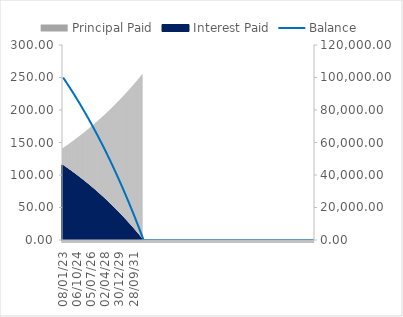
| Category | Principal Paid | Interest Paid |
|---|---|---|
| 08/01/23 | 140.547 | 115.163 |
| 15/01/23 | 140.708 | 115.002 |
| 22/01/23 | 140.87 | 114.839 |
| 29/01/23 | 141.033 | 114.677 |
| 05/02/23 | 141.195 | 114.515 |
| 12/02/23 | 141.358 | 114.352 |
| 19/02/23 | 141.52 | 114.189 |
| 26/02/23 | 141.683 | 114.026 |
| 05/03/23 | 141.847 | 113.863 |
| 12/03/23 | 142.01 | 113.7 |
| 19/03/23 | 142.174 | 113.536 |
| 26/03/23 | 142.337 | 113.373 |
| 02/04/23 | 142.501 | 113.209 |
| 09/04/23 | 142.665 | 113.045 |
| 16/04/23 | 142.83 | 112.88 |
| 23/04/23 | 142.994 | 112.716 |
| 30/04/23 | 143.159 | 112.551 |
| 07/05/23 | 143.324 | 112.386 |
| 14/05/23 | 143.489 | 112.221 |
| 21/05/23 | 143.654 | 112.056 |
| 28/05/23 | 143.819 | 111.891 |
| 04/06/23 | 143.985 | 111.725 |
| 11/06/23 | 144.151 | 111.559 |
| 18/06/23 | 144.317 | 111.393 |
| 25/06/23 | 144.483 | 111.227 |
| 02/07/23 | 144.649 | 111.061 |
| 09/07/23 | 144.816 | 110.894 |
| 16/07/23 | 144.983 | 110.727 |
| 23/07/23 | 145.15 | 110.56 |
| 30/07/23 | 145.317 | 110.393 |
| 06/08/23 | 145.484 | 110.226 |
| 13/08/23 | 145.652 | 110.058 |
| 20/08/23 | 145.82 | 109.89 |
| 27/08/23 | 145.987 | 109.722 |
| 03/09/23 | 146.156 | 109.554 |
| 10/09/23 | 146.324 | 109.386 |
| 17/09/23 | 146.492 | 109.218 |
| 24/09/23 | 146.661 | 109.049 |
| 01/10/23 | 146.83 | 108.88 |
| 08/10/23 | 146.999 | 108.711 |
| 15/10/23 | 147.168 | 108.542 |
| 22/10/23 | 147.338 | 108.372 |
| 29/10/23 | 147.508 | 108.202 |
| 05/11/23 | 147.677 | 108.032 |
| 12/11/23 | 147.848 | 107.862 |
| 19/11/23 | 148.018 | 107.692 |
| 26/11/23 | 148.188 | 107.522 |
| 03/12/23 | 148.359 | 107.351 |
| 10/12/23 | 148.53 | 107.18 |
| 17/12/23 | 148.701 | 107.009 |
| 24/12/23 | 148.872 | 106.838 |
| 31/12/23 | 149.043 | 106.666 |
| 07/01/24 | 149.215 | 106.495 |
| 14/01/24 | 149.387 | 106.323 |
| 21/01/24 | 149.559 | 106.151 |
| 28/01/24 | 149.731 | 105.979 |
| 04/02/24 | 149.904 | 105.806 |
| 11/02/24 | 150.076 | 105.634 |
| 18/02/24 | 150.249 | 105.461 |
| 25/02/24 | 150.422 | 105.288 |
| 03/03/24 | 150.595 | 105.114 |
| 10/03/24 | 150.769 | 104.941 |
| 17/03/24 | 150.942 | 104.767 |
| 24/03/24 | 151.116 | 104.594 |
| 31/03/24 | 151.29 | 104.42 |
| 07/04/24 | 151.465 | 104.245 |
| 14/04/24 | 151.639 | 104.071 |
| 21/04/24 | 151.814 | 103.896 |
| 28/04/24 | 151.988 | 103.721 |
| 05/05/24 | 152.164 | 103.546 |
| 12/05/24 | 152.339 | 103.371 |
| 19/05/24 | 152.514 | 103.196 |
| 26/05/24 | 152.69 | 103.02 |
| 02/06/24 | 152.866 | 102.844 |
| 09/06/24 | 153.042 | 102.668 |
| 16/06/24 | 153.218 | 102.492 |
| 23/06/24 | 153.394 | 102.315 |
| 30/06/24 | 153.571 | 102.139 |
| 07/07/24 | 153.748 | 101.962 |
| 14/07/24 | 153.925 | 101.785 |
| 21/07/24 | 154.102 | 101.608 |
| 28/07/24 | 154.28 | 101.43 |
| 04/08/24 | 154.457 | 101.253 |
| 11/08/24 | 154.635 | 101.075 |
| 18/08/24 | 154.813 | 100.897 |
| 25/08/24 | 154.992 | 100.718 |
| 01/09/24 | 155.17 | 100.54 |
| 08/09/24 | 155.349 | 100.361 |
| 15/09/24 | 155.528 | 100.182 |
| 22/09/24 | 155.707 | 100.003 |
| 29/09/24 | 155.886 | 99.824 |
| 06/10/24 | 156.066 | 99.644 |
| 13/10/24 | 156.245 | 99.464 |
| 20/10/24 | 156.425 | 99.285 |
| 27/10/24 | 156.606 | 99.104 |
| 03/11/24 | 156.786 | 98.924 |
| 10/11/24 | 156.966 | 98.743 |
| 17/11/24 | 157.147 | 98.563 |
| 24/11/24 | 157.328 | 98.382 |
| 01/12/24 | 157.509 | 98.201 |
| 08/12/24 | 157.691 | 98.019 |
| 15/12/24 | 157.872 | 97.838 |
| 22/12/24 | 158.054 | 97.656 |
| 29/12/24 | 158.236 | 97.474 |
| 05/01/25 | 158.418 | 97.292 |
| 12/01/25 | 158.601 | 97.109 |
| 19/01/25 | 158.783 | 96.926 |
| 26/01/25 | 158.966 | 96.744 |
| 02/02/25 | 159.149 | 96.56 |
| 09/02/25 | 159.333 | 96.377 |
| 16/02/25 | 159.516 | 96.194 |
| 23/02/25 | 159.7 | 96.01 |
| 02/03/25 | 159.884 | 95.826 |
| 09/03/25 | 160.068 | 95.642 |
| 16/03/25 | 160.252 | 95.458 |
| 23/03/25 | 160.437 | 95.273 |
| 30/03/25 | 160.622 | 95.088 |
| 06/04/25 | 160.807 | 94.903 |
| 13/04/25 | 160.992 | 94.718 |
| 20/04/25 | 161.177 | 94.533 |
| 27/04/25 | 161.363 | 94.347 |
| 04/05/25 | 161.549 | 94.161 |
| 11/05/25 | 161.735 | 93.975 |
| 18/05/25 | 161.921 | 93.789 |
| 25/05/25 | 162.107 | 93.603 |
| 01/06/25 | 162.294 | 93.416 |
| 08/06/25 | 162.481 | 93.229 |
| 15/06/25 | 162.668 | 93.042 |
| 22/06/25 | 162.855 | 92.854 |
| 29/06/25 | 163.043 | 92.667 |
| 06/07/25 | 163.231 | 92.479 |
| 13/07/25 | 163.419 | 92.291 |
| 20/07/25 | 163.607 | 92.103 |
| 27/07/25 | 163.795 | 91.915 |
| 03/08/25 | 163.984 | 91.726 |
| 10/08/25 | 164.173 | 91.537 |
| 17/08/25 | 164.362 | 91.348 |
| 24/08/25 | 164.551 | 91.159 |
| 31/08/25 | 164.741 | 90.969 |
| 07/09/25 | 164.93 | 90.779 |
| 14/09/25 | 165.12 | 90.59 |
| 21/09/25 | 165.311 | 90.399 |
| 28/09/25 | 165.501 | 90.209 |
| 05/10/25 | 165.691 | 90.018 |
| 12/10/25 | 165.882 | 89.828 |
| 19/10/25 | 166.073 | 89.637 |
| 26/10/25 | 166.265 | 89.445 |
| 02/11/25 | 166.456 | 89.254 |
| 09/11/25 | 166.648 | 89.062 |
| 16/11/25 | 166.84 | 88.87 |
| 23/11/25 | 167.032 | 88.678 |
| 30/11/25 | 167.224 | 88.486 |
| 07/12/25 | 167.417 | 88.293 |
| 14/12/25 | 167.61 | 88.1 |
| 21/12/25 | 167.803 | 87.907 |
| 28/12/25 | 167.996 | 87.714 |
| 04/01/26 | 168.189 | 87.521 |
| 11/01/26 | 168.383 | 87.327 |
| 18/01/26 | 168.577 | 87.133 |
| 25/01/26 | 168.771 | 86.939 |
| 01/02/26 | 168.965 | 86.744 |
| 08/02/26 | 169.16 | 86.55 |
| 15/02/26 | 169.355 | 86.355 |
| 22/02/26 | 169.55 | 86.16 |
| 01/03/26 | 169.745 | 85.965 |
| 08/03/26 | 169.941 | 85.769 |
| 15/03/26 | 170.136 | 85.574 |
| 22/03/26 | 170.332 | 85.378 |
| 29/03/26 | 170.528 | 85.182 |
| 05/04/26 | 170.725 | 84.985 |
| 12/04/26 | 170.921 | 84.789 |
| 19/04/26 | 171.118 | 84.592 |
| 26/04/26 | 171.315 | 84.395 |
| 03/05/26 | 171.513 | 84.197 |
| 10/05/26 | 171.71 | 84 |
| 17/05/26 | 171.908 | 83.802 |
| 24/05/26 | 172.106 | 83.604 |
| 31/05/26 | 172.304 | 83.406 |
| 07/06/26 | 172.502 | 83.207 |
| 14/06/26 | 172.701 | 83.009 |
| 21/06/26 | 172.9 | 82.81 |
| 28/06/26 | 173.099 | 82.611 |
| 05/07/26 | 173.298 | 82.411 |
| 12/07/26 | 173.498 | 82.212 |
| 19/07/26 | 173.698 | 82.012 |
| 26/07/26 | 173.898 | 81.812 |
| 02/08/26 | 174.098 | 81.612 |
| 09/08/26 | 174.299 | 81.411 |
| 16/08/26 | 174.499 | 81.211 |
| 23/08/26 | 174.7 | 81.01 |
| 30/08/26 | 174.902 | 80.808 |
| 06/09/26 | 175.103 | 80.607 |
| 13/09/26 | 175.305 | 80.405 |
| 20/09/26 | 175.507 | 80.203 |
| 27/09/26 | 175.709 | 80.001 |
| 04/10/26 | 175.911 | 79.799 |
| 11/10/26 | 176.114 | 79.596 |
| 18/10/26 | 176.316 | 79.394 |
| 25/10/26 | 176.519 | 79.19 |
| 01/11/26 | 176.723 | 78.987 |
| 08/11/26 | 176.926 | 78.784 |
| 15/11/26 | 177.13 | 78.58 |
| 22/11/26 | 177.334 | 78.376 |
| 29/11/26 | 177.538 | 78.172 |
| 06/12/26 | 177.743 | 77.967 |
| 13/12/26 | 177.947 | 77.763 |
| 20/12/26 | 178.152 | 77.558 |
| 27/12/26 | 178.357 | 77.352 |
| 03/01/27 | 178.563 | 77.147 |
| 10/01/27 | 178.768 | 76.941 |
| 17/01/27 | 178.974 | 76.736 |
| 24/01/27 | 179.18 | 76.529 |
| 31/01/27 | 179.387 | 76.323 |
| 07/02/27 | 179.593 | 76.116 |
| 14/02/27 | 179.8 | 75.91 |
| 21/02/27 | 180.007 | 75.703 |
| 28/02/27 | 180.215 | 75.495 |
| 07/03/27 | 180.422 | 75.288 |
| 14/03/27 | 180.63 | 75.08 |
| 21/03/27 | 180.838 | 74.872 |
| 28/03/27 | 181.046 | 74.664 |
| 04/04/27 | 181.255 | 74.455 |
| 11/04/27 | 181.463 | 74.246 |
| 18/04/27 | 181.672 | 74.037 |
| 25/04/27 | 181.882 | 73.828 |
| 02/05/27 | 182.091 | 73.619 |
| 09/05/27 | 182.301 | 73.409 |
| 16/05/27 | 182.511 | 73.199 |
| 23/05/27 | 182.721 | 72.989 |
| 30/05/27 | 182.931 | 72.779 |
| 06/06/27 | 183.142 | 72.568 |
| 13/06/27 | 183.353 | 72.357 |
| 20/06/27 | 183.564 | 72.146 |
| 27/06/27 | 183.776 | 71.934 |
| 04/07/27 | 183.987 | 71.723 |
| 11/07/27 | 184.199 | 71.511 |
| 18/07/27 | 184.411 | 71.299 |
| 25/07/27 | 184.624 | 71.086 |
| 01/08/27 | 184.836 | 70.874 |
| 08/08/27 | 185.049 | 70.661 |
| 15/08/27 | 185.262 | 70.448 |
| 22/08/27 | 185.475 | 70.234 |
| 29/08/27 | 185.689 | 70.021 |
| 05/09/27 | 185.903 | 69.807 |
| 12/09/27 | 186.117 | 69.593 |
| 19/09/27 | 186.331 | 69.379 |
| 26/09/27 | 186.546 | 69.164 |
| 03/10/27 | 186.761 | 68.949 |
| 10/10/27 | 186.976 | 68.734 |
| 17/10/27 | 187.191 | 68.519 |
| 24/10/27 | 187.407 | 68.303 |
| 31/10/27 | 187.623 | 68.087 |
| 07/11/27 | 187.839 | 67.871 |
| 14/11/27 | 188.055 | 67.655 |
| 21/11/27 | 188.272 | 67.438 |
| 28/11/27 | 188.488 | 67.222 |
| 05/12/27 | 188.705 | 67.004 |
| 12/12/27 | 188.923 | 66.787 |
| 19/12/27 | 189.14 | 66.57 |
| 26/12/27 | 189.358 | 66.352 |
| 02/01/28 | 189.576 | 66.134 |
| 09/01/28 | 189.795 | 65.915 |
| 16/01/28 | 190.013 | 65.697 |
| 23/01/28 | 190.232 | 65.478 |
| 30/01/28 | 190.451 | 65.259 |
| 06/02/28 | 190.67 | 65.04 |
| 13/02/28 | 190.89 | 64.82 |
| 20/02/28 | 191.11 | 64.6 |
| 27/02/28 | 191.33 | 64.38 |
| 05/03/28 | 191.55 | 64.16 |
| 12/03/28 | 191.771 | 63.939 |
| 19/03/28 | 191.992 | 63.718 |
| 26/03/28 | 192.213 | 63.497 |
| 02/04/28 | 192.434 | 63.276 |
| 09/04/28 | 192.656 | 63.054 |
| 16/04/28 | 192.878 | 62.832 |
| 23/04/28 | 193.1 | 62.61 |
| 30/04/28 | 193.322 | 62.388 |
| 07/05/28 | 193.545 | 62.165 |
| 14/05/28 | 193.768 | 61.942 |
| 21/05/28 | 193.991 | 61.719 |
| 28/05/28 | 194.214 | 61.496 |
| 04/06/28 | 194.438 | 61.272 |
| 11/06/28 | 194.662 | 61.048 |
| 18/06/28 | 194.886 | 60.824 |
| 25/06/28 | 195.11 | 60.6 |
| 02/07/28 | 195.335 | 60.375 |
| 09/07/28 | 195.56 | 60.15 |
| 16/07/28 | 195.785 | 59.925 |
| 23/07/28 | 196.011 | 59.699 |
| 30/07/28 | 196.236 | 59.473 |
| 06/08/28 | 196.462 | 59.247 |
| 13/08/28 | 196.689 | 59.021 |
| 20/08/28 | 196.915 | 58.795 |
| 27/08/28 | 197.142 | 58.568 |
| 03/09/28 | 197.369 | 58.341 |
| 10/09/28 | 197.596 | 58.114 |
| 17/09/28 | 197.824 | 57.886 |
| 24/09/28 | 198.052 | 57.658 |
| 01/10/28 | 198.28 | 57.43 |
| 08/10/28 | 198.508 | 57.202 |
| 15/10/28 | 198.737 | 56.973 |
| 22/10/28 | 198.966 | 56.744 |
| 29/10/28 | 199.195 | 56.515 |
| 05/11/28 | 199.424 | 56.286 |
| 12/11/28 | 199.654 | 56.056 |
| 19/11/28 | 199.884 | 55.826 |
| 26/11/28 | 200.114 | 55.596 |
| 03/12/28 | 200.344 | 55.366 |
| 10/12/28 | 200.575 | 55.135 |
| 17/12/28 | 200.806 | 54.904 |
| 24/12/28 | 201.037 | 54.673 |
| 31/12/28 | 201.269 | 54.441 |
| 07/01/29 | 201.501 | 54.209 |
| 14/01/29 | 201.733 | 53.977 |
| 21/01/29 | 201.965 | 53.745 |
| 28/01/29 | 202.198 | 53.512 |
| 04/02/29 | 202.43 | 53.279 |
| 11/02/29 | 202.664 | 53.046 |
| 18/02/29 | 202.897 | 52.813 |
| 25/02/29 | 203.131 | 52.579 |
| 04/03/29 | 203.365 | 52.345 |
| 11/03/29 | 203.599 | 52.111 |
| 18/03/29 | 203.833 | 51.877 |
| 25/03/29 | 204.068 | 51.642 |
| 01/04/29 | 204.303 | 51.407 |
| 08/04/29 | 204.538 | 51.172 |
| 15/04/29 | 204.774 | 50.936 |
| 22/04/29 | 205.01 | 50.7 |
| 29/04/29 | 205.246 | 50.464 |
| 06/05/29 | 205.482 | 50.228 |
| 13/05/29 | 205.719 | 49.991 |
| 20/05/29 | 205.956 | 49.754 |
| 27/05/29 | 206.193 | 49.517 |
| 03/06/29 | 206.43 | 49.28 |
| 10/06/29 | 206.668 | 49.042 |
| 17/06/29 | 206.906 | 48.804 |
| 24/06/29 | 207.144 | 48.566 |
| 01/07/29 | 207.383 | 48.327 |
| 08/07/29 | 207.622 | 48.088 |
| 15/07/29 | 207.861 | 47.849 |
| 22/07/29 | 208.1 | 47.61 |
| 29/07/29 | 208.34 | 47.37 |
| 05/08/29 | 208.58 | 47.13 |
| 12/08/29 | 208.82 | 46.89 |
| 19/08/29 | 209.061 | 46.649 |
| 26/08/29 | 209.301 | 46.409 |
| 02/09/29 | 209.542 | 46.168 |
| 09/09/29 | 209.784 | 45.926 |
| 16/09/29 | 210.025 | 45.685 |
| 23/09/29 | 210.267 | 45.443 |
| 30/09/29 | 210.509 | 45.201 |
| 07/10/29 | 210.752 | 44.958 |
| 14/10/29 | 210.994 | 44.716 |
| 21/10/29 | 211.237 | 44.473 |
| 28/10/29 | 211.481 | 44.229 |
| 04/11/29 | 211.724 | 43.986 |
| 11/11/29 | 211.968 | 43.742 |
| 18/11/29 | 212.212 | 43.498 |
| 25/11/29 | 212.457 | 43.253 |
| 02/12/29 | 212.701 | 43.009 |
| 09/12/29 | 212.946 | 42.764 |
| 16/12/29 | 213.191 | 42.519 |
| 23/12/29 | 213.437 | 42.273 |
| 30/12/29 | 213.683 | 42.027 |
| 06/01/30 | 213.929 | 41.781 |
| 13/01/30 | 214.175 | 41.535 |
| 20/01/30 | 214.422 | 41.288 |
| 27/01/30 | 214.669 | 41.041 |
| 03/02/30 | 214.916 | 40.794 |
| 10/02/30 | 215.163 | 40.546 |
| 17/02/30 | 215.411 | 40.299 |
| 24/02/30 | 215.659 | 40.051 |
| 03/03/30 | 215.908 | 39.802 |
| 10/03/30 | 216.156 | 39.554 |
| 17/03/30 | 216.405 | 39.305 |
| 24/03/30 | 216.654 | 39.055 |
| 31/03/30 | 216.904 | 38.806 |
| 07/04/30 | 217.154 | 38.556 |
| 14/04/30 | 217.404 | 38.306 |
| 21/04/30 | 217.654 | 38.056 |
| 28/04/30 | 217.905 | 37.805 |
| 05/05/30 | 218.156 | 37.554 |
| 12/05/30 | 218.407 | 37.303 |
| 19/05/30 | 218.659 | 37.051 |
| 26/05/30 | 218.91 | 36.8 |
| 02/06/30 | 219.163 | 36.547 |
| 09/06/30 | 219.415 | 36.295 |
| 16/06/30 | 219.668 | 36.042 |
| 23/06/30 | 219.921 | 35.789 |
| 30/06/30 | 220.174 | 35.536 |
| 07/07/30 | 220.427 | 35.283 |
| 14/07/30 | 220.681 | 35.029 |
| 21/07/30 | 220.935 | 34.775 |
| 28/07/30 | 221.19 | 34.52 |
| 04/08/30 | 221.445 | 34.265 |
| 11/08/30 | 221.7 | 34.01 |
| 18/08/30 | 221.955 | 33.755 |
| 25/08/30 | 222.211 | 33.499 |
| 01/09/30 | 222.466 | 33.243 |
| 08/09/30 | 222.723 | 32.987 |
| 15/09/30 | 222.979 | 32.731 |
| 22/09/30 | 223.236 | 32.474 |
| 29/09/30 | 223.493 | 32.217 |
| 06/10/30 | 223.75 | 31.96 |
| 13/10/30 | 224.008 | 31.702 |
| 20/10/30 | 224.266 | 31.444 |
| 27/10/30 | 224.524 | 31.186 |
| 03/11/30 | 224.783 | 30.927 |
| 10/11/30 | 225.042 | 30.668 |
| 17/11/30 | 225.301 | 30.409 |
| 24/11/30 | 225.56 | 30.15 |
| 01/12/30 | 225.82 | 29.89 |
| 08/12/30 | 226.08 | 29.63 |
| 15/12/30 | 226.341 | 29.369 |
| 22/12/30 | 226.601 | 29.109 |
| 29/12/30 | 226.862 | 28.848 |
| 05/01/31 | 227.123 | 28.586 |
| 12/01/31 | 227.385 | 28.325 |
| 19/01/31 | 227.647 | 28.063 |
| 26/01/31 | 227.909 | 27.801 |
| 02/02/31 | 228.171 | 27.538 |
| 09/02/31 | 228.434 | 27.276 |
| 16/02/31 | 228.697 | 27.013 |
| 23/02/31 | 228.961 | 26.749 |
| 02/03/31 | 229.224 | 26.486 |
| 09/03/31 | 229.488 | 26.222 |
| 16/03/31 | 229.753 | 25.957 |
| 23/03/31 | 230.017 | 25.693 |
| 30/03/31 | 230.282 | 25.428 |
| 06/04/31 | 230.547 | 25.163 |
| 13/04/31 | 230.813 | 24.897 |
| 20/04/31 | 231.079 | 24.631 |
| 27/04/31 | 231.345 | 24.365 |
| 04/05/31 | 231.611 | 24.099 |
| 11/05/31 | 231.878 | 23.832 |
| 18/05/31 | 232.145 | 23.565 |
| 25/05/31 | 232.412 | 23.298 |
| 01/06/31 | 232.68 | 23.03 |
| 08/06/31 | 232.948 | 22.762 |
| 15/06/31 | 233.216 | 22.494 |
| 22/06/31 | 233.485 | 22.225 |
| 29/06/31 | 233.754 | 21.956 |
| 06/07/31 | 234.023 | 21.687 |
| 13/07/31 | 234.292 | 21.418 |
| 20/07/31 | 234.562 | 21.148 |
| 27/07/31 | 234.832 | 20.878 |
| 03/08/31 | 235.103 | 20.607 |
| 10/08/31 | 235.374 | 20.336 |
| 17/08/31 | 235.645 | 20.065 |
| 24/08/31 | 235.916 | 19.794 |
| 31/08/31 | 236.188 | 19.522 |
| 07/09/31 | 236.46 | 19.25 |
| 14/09/31 | 236.732 | 18.978 |
| 21/09/31 | 237.005 | 18.705 |
| 28/09/31 | 237.278 | 18.432 |
| 05/10/31 | 237.551 | 18.159 |
| 12/10/31 | 237.824 | 17.886 |
| 19/10/31 | 238.098 | 17.612 |
| 26/10/31 | 238.372 | 17.337 |
| 02/11/31 | 238.647 | 17.063 |
| 09/11/31 | 238.922 | 16.788 |
| 16/11/31 | 239.197 | 16.513 |
| 23/11/31 | 239.472 | 16.237 |
| 30/11/31 | 239.748 | 15.962 |
| 07/12/31 | 240.024 | 15.686 |
| 14/12/31 | 240.301 | 15.409 |
| 21/12/31 | 240.577 | 15.132 |
| 28/12/31 | 240.855 | 14.855 |
| 04/01/32 | 241.132 | 14.578 |
| 11/01/32 | 241.41 | 14.3 |
| 18/01/32 | 241.688 | 14.022 |
| 25/01/32 | 241.966 | 13.744 |
| 01/02/32 | 242.245 | 13.465 |
| 08/02/32 | 242.524 | 13.186 |
| 15/02/32 | 242.803 | 12.907 |
| 22/02/32 | 243.083 | 12.627 |
| 29/02/32 | 243.362 | 12.347 |
| 07/03/32 | 243.643 | 12.067 |
| 14/03/32 | 243.923 | 11.787 |
| 21/03/32 | 244.204 | 11.506 |
| 28/03/32 | 244.485 | 11.224 |
| 04/04/32 | 244.767 | 10.943 |
| 11/04/32 | 245.049 | 10.661 |
| 18/04/32 | 245.331 | 10.379 |
| 25/04/32 | 245.614 | 10.096 |
| 02/05/32 | 245.896 | 9.813 |
| 09/05/32 | 246.18 | 9.53 |
| 16/05/32 | 246.463 | 9.247 |
| 23/05/32 | 246.747 | 8.963 |
| 30/05/32 | 247.031 | 8.679 |
| 06/06/32 | 247.316 | 8.394 |
| 13/06/32 | 247.6 | 8.109 |
| 20/06/32 | 247.886 | 7.824 |
| 27/06/32 | 248.171 | 7.539 |
| 04/07/32 | 248.457 | 7.253 |
| 11/07/32 | 248.743 | 6.967 |
| 18/07/32 | 249.029 | 6.68 |
| 25/07/32 | 249.316 | 6.394 |
| 01/08/32 | 249.603 | 6.107 |
| 08/08/32 | 249.891 | 5.819 |
| 15/08/32 | 250.179 | 5.531 |
| 22/08/32 | 250.467 | 5.243 |
| 29/08/32 | 250.755 | 4.955 |
| 05/09/32 | 251.044 | 4.666 |
| 12/09/32 | 251.333 | 4.377 |
| 19/09/32 | 251.623 | 4.087 |
| 26/09/32 | 251.912 | 3.798 |
| 03/10/32 | 252.202 | 3.507 |
| 10/10/32 | 252.493 | 3.217 |
| 17/10/32 | 252.784 | 2.926 |
| 24/10/32 | 253.075 | 2.635 |
| 31/10/32 | 253.366 | 2.344 |
| 07/11/32 | 253.658 | 2.052 |
| 14/11/32 | 253.95 | 1.76 |
| 21/11/32 | 254.243 | 1.467 |
| 28/11/32 | 254.535 | 1.175 |
| 05/12/32 | 254.828 | 0.881 |
| 12/12/32 | 255.122 | 0.588 |
| 19/12/32 | 255.416 | 0.294 |